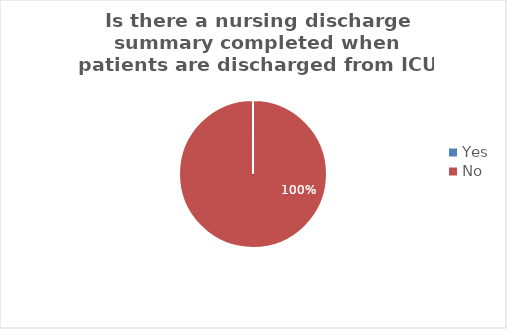
| Category | Is there a nursing discharge summary completed when patients are discharged from ICU to the ward? |
|---|---|
| Yes | 0 |
| No | 1 |